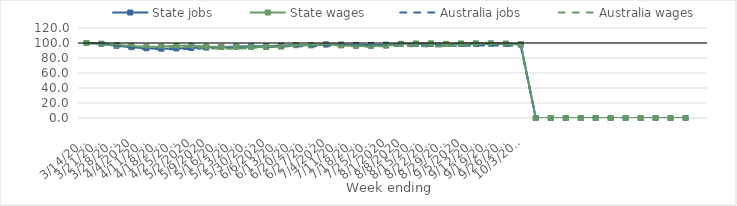
| Category | State jobs | State wages | Australia jobs | Australia wages |
|---|---|---|---|---|
| 14/03/2020 | 100 | 100 | 100 | 100 |
| 21/03/2020 | 98.875 | 98.902 | 99.271 | 99.673 |
| 28/03/2020 | 96.297 | 97.178 | 96.296 | 98.402 |
| 04/04/2020 | 94.474 | 96.146 | 93.638 | 96.698 |
| 11/04/2020 | 92.968 | 95.111 | 91.923 | 94.162 |
| 18/04/2020 | 92.44 | 95.303 | 91.471 | 94.06 |
| 25/04/2020 | 92.773 | 96.192 | 91.807 | 94.247 |
| 02/05/2020 | 93.289 | 96.528 | 92.206 | 94.699 |
| 09/05/2020 | 93.894 | 95.268 | 92.756 | 93.319 |
| 16/05/2020 | 94.738 | 94.825 | 93.289 | 92.663 |
| 23/05/2020 | 95.404 | 94.778 | 93.593 | 92.285 |
| 30/05/2020 | 95.662 | 94.683 | 94.094 | 93.58 |
| 06/06/2020 | 95.605 | 94.646 | 95.016 | 95.453 |
| 13/06/2020 | 96.526 | 95.119 | 95.471 | 96.086 |
| 20/06/2020 | 97.284 | 97.121 | 95.658 | 97.003 |
| 27/06/2020 | 96.956 | 97.304 | 95.603 | 97.208 |
| 04/07/2020 | 97.972 | 98.216 | 96.357 | 98.944 |
| 11/07/2020 | 97.966 | 96.771 | 96.686 | 95.884 |
| 18/07/2020 | 97.408 | 96.118 | 96.562 | 95.403 |
| 25/07/2020 | 97.392 | 95.797 | 96.622 | 95.053 |
| 01/08/2020 | 97.789 | 96.419 | 96.719 | 95.78 |
| 08/08/2020 | 98.837 | 98.742 | 96.574 | 96.121 |
| 15/08/2020 | 98.909 | 99.373 | 96.402 | 95.627 |
| 22/08/2020 | 98.698 | 99.63 | 96.279 | 95.418 |
| 29/08/2020 | 98.673 | 98.807 | 96.2 | 95.474 |
| 05/09/2020 | 98.697 | 99.513 | 96.273 | 97.682 |
| 12/09/2020 | 98.831 | 99.634 | 96.568 | 98.358 |
| 19/09/2020 | 98.992 | 99.546 | 96.733 | 98.934 |
| 26/09/2020 | 98.858 | 99.231 | 96.519 | 98.073 |
| 03/10/2020 | 97.853 | 98.61 | 95.865 | 96.714 |